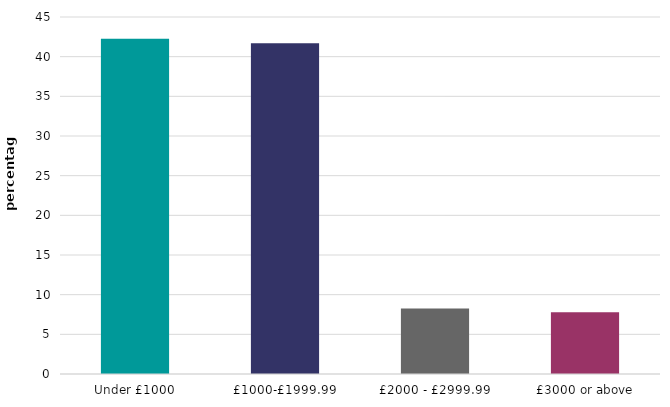
| Category | all dwelling types |
|---|---|
| Under £1000 | 42.271 |
| £1000-£1999.99 | 41.688 |
| £2000 - £2999.99 | 8.255 |
| £3000 or above | 7.786 |